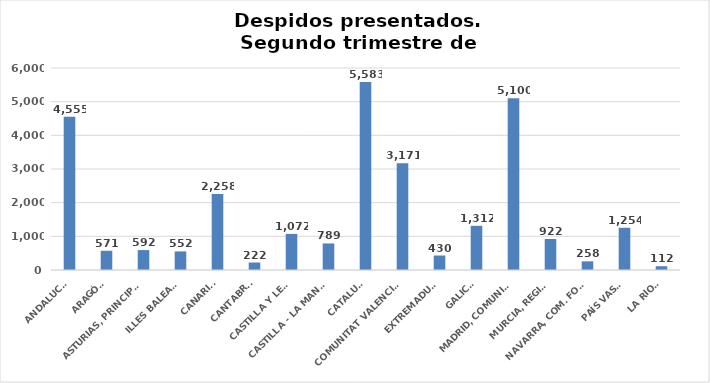
| Category | Series 0 |
|---|---|
| ANDALUCÍA | 4555 |
| ARAGÓN | 571 |
| ASTURIAS, PRINCIPADO | 592 |
| ILLES BALEARS | 552 |
| CANARIAS | 2258 |
| CANTABRIA | 222 |
| CASTILLA Y LEÓN | 1072 |
| CASTILLA - LA MANCHA | 789 |
| CATALUÑA | 5583 |
| COMUNITAT VALENCIANA | 3171 |
| EXTREMADURA | 430 |
| GALICIA | 1312 |
| MADRID, COMUNIDAD | 5100 |
| MURCIA, REGIÓN | 922 |
| NAVARRA, COM. FORAL | 258 |
| PAÍS VASCO | 1254 |
| LA RIOJA | 112 |